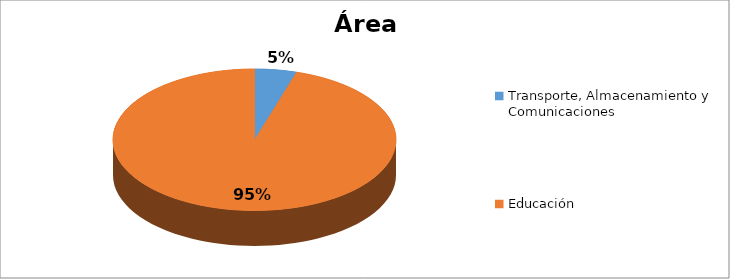
| Category | Series 0 |
|---|---|
| Transporte, Almacenamiento y Comunicaciones | 0.048 |
| Educación | 0.952 |